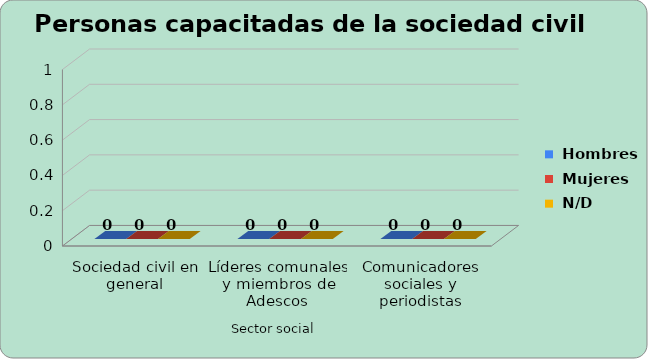
| Category | Hombres | Mujeres | N/D |
|---|---|---|---|
| Sociedad civil en general | 0 | 0 | 0 |
| Líderes comunales y miembros de Adescos | 0 | 0 | 0 |
| Comunicadores sociales y periodistas | 0 | 0 | 0 |